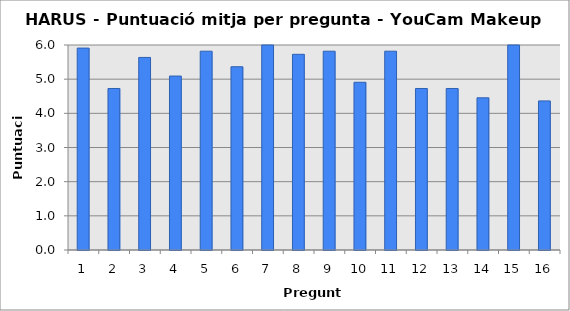
| Category | Series 0 |
|---|---|
| 1.0 | 5.909 |
| 2.0 | 4.727 |
| 3.0 | 5.636 |
| 4.0 | 5.091 |
| 5.0 | 5.818 |
| 6.0 | 5.364 |
| 7.0 | 6 |
| 8.0 | 5.727 |
| 9.0 | 5.818 |
| 10.0 | 4.909 |
| 11.0 | 5.818 |
| 12.0 | 4.727 |
| 13.0 | 4.727 |
| 14.0 | 4.455 |
| 15.0 | 6 |
| 16.0 | 4.364 |